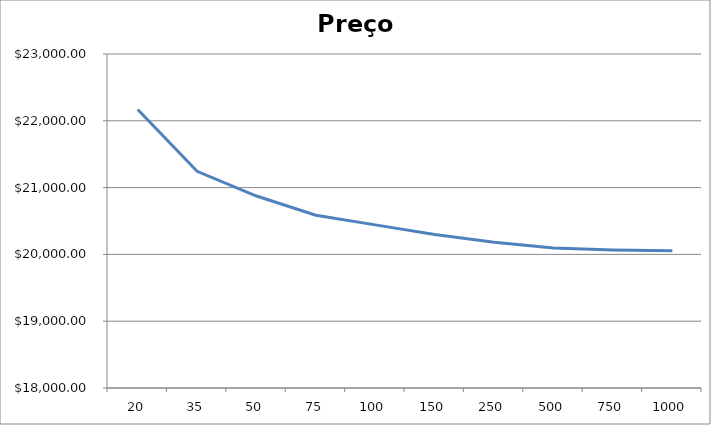
| Category | Preço p/carro |
|---|---|
| 20.0 | 22170 |
| 35.0 | 21244.286 |
| 50.0 | 20874 |
| 75.0 | 20586 |
| 100.0 | 20442 |
| 150.0 | 20298 |
| 250.0 | 20182.8 |
| 500.0 | 20096.4 |
| 750.0 | 20067.6 |
| 1000.0 | 20053.2 |